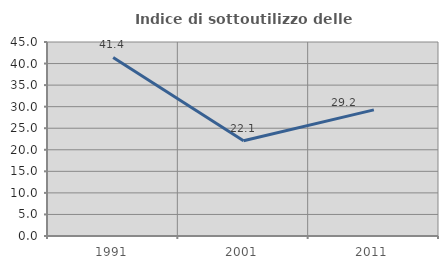
| Category | Indice di sottoutilizzo delle abitazioni  |
|---|---|
| 1991.0 | 41.429 |
| 2001.0 | 22.093 |
| 2011.0 | 29.249 |